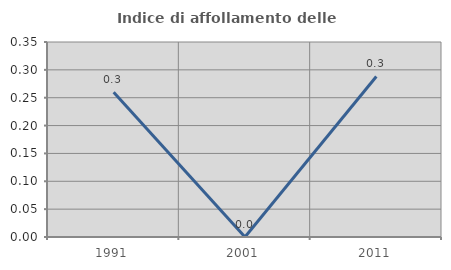
| Category | Indice di affollamento delle abitazioni  |
|---|---|
| 1991.0 | 0.26 |
| 2001.0 | 0 |
| 2011.0 | 0.288 |